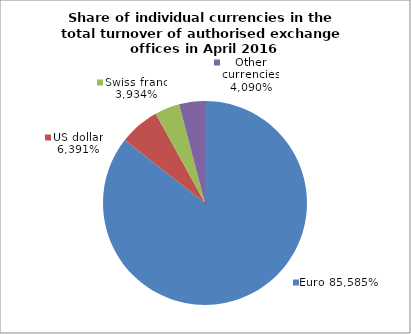
| Category | EUR |
|---|---|
| 0 | 0.856 |
| 1 | 0.064 |
| 2 | 0.039 |
| 3 | 0.041 |